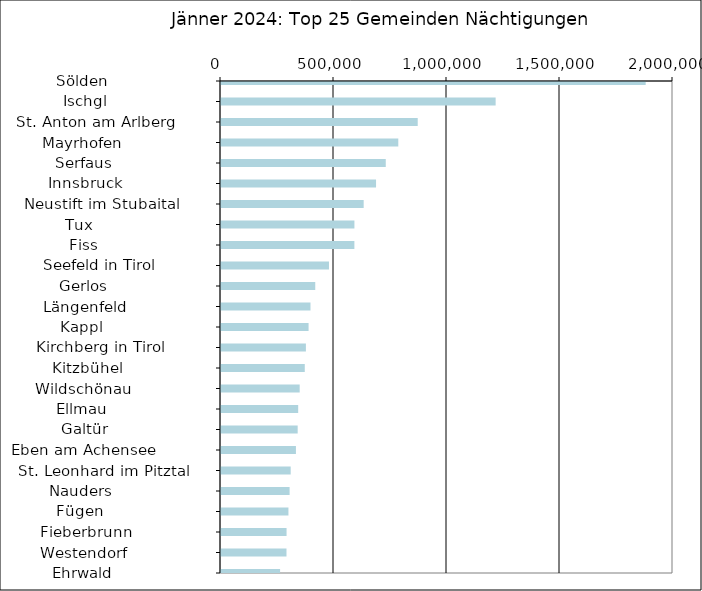
| Category | Series 0 |
|---|---|
|   Sölden                     | 1879182 |
|   Ischgl                     | 1215193 |
|   St. Anton am Arlberg       | 870451 |
|   Mayrhofen                  | 784433 |
|   Serfaus                    | 729040 |
|   Innsbruck                  | 686035 |
|   Neustift im Stubaital      | 631275 |
|   Tux                        | 590351 |
|   Fiss                       | 590178 |
|   Seefeld in Tirol           | 477773 |
|   Gerlos                     | 417034 |
|   Längenfeld                 | 395928 |
|   Kappl                      | 387483 |
|   Kirchberg in Tirol         | 375641 |
|   Kitzbühel                  | 370667 |
|   Wildschönau                | 348145 |
|   Ellmau                     | 341499 |
|   Galtür                     | 339283 |
|   Eben am Achensee           | 331560 |
|   St. Leonhard im Pitztal    | 308338 |
|   Nauders                    | 303566 |
|   Fügen                      | 298378 |
|   Fieberbrunn                | 290089 |
|   Westendorf                 | 289737 |
|   Ehrwald                    | 261426 |